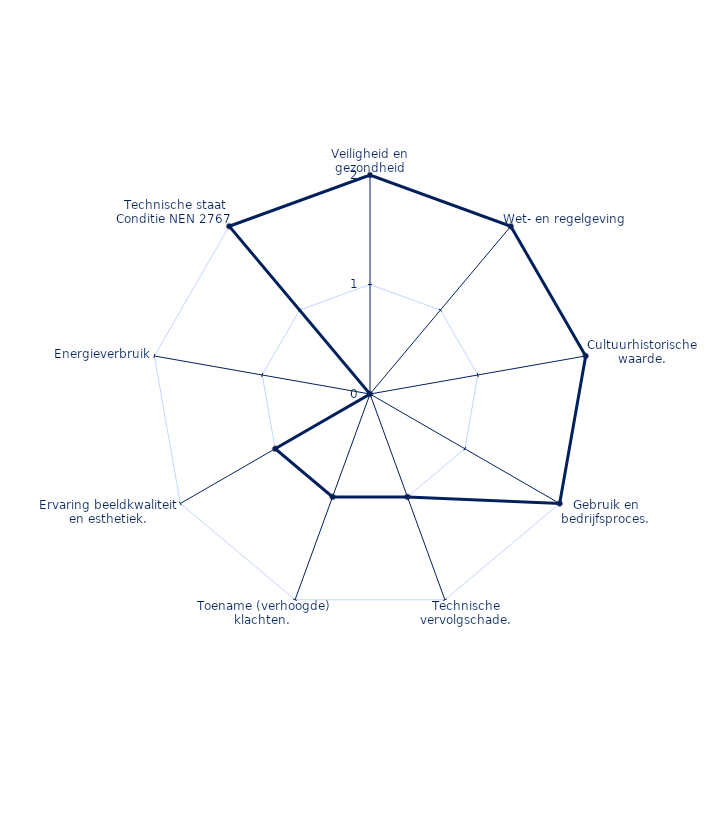
| Category | Series 0 |
|---|---|
| Veiligheid en gezondheid | 2 |
| Wet- en regelgeving | 2 |
| Cultuurhistorische waarde. | 2 |
| Gebruik en bedrijfsproces. | 2 |
| Technische vervolgschade. | 1 |
| Toename (verhoogde) klachten.  | 1 |
| Ervaring beeldkwaliteit en esthetiek. | 1 |
| Energieverbruik | 0 |
| Technische staat Conditie NEN 2767  | 2 |